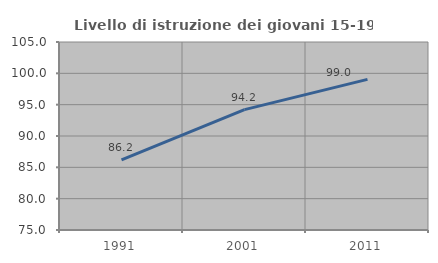
| Category | Livello di istruzione dei giovani 15-19 anni |
|---|---|
| 1991.0 | 86.19 |
| 2001.0 | 94.215 |
| 2011.0 | 99.029 |